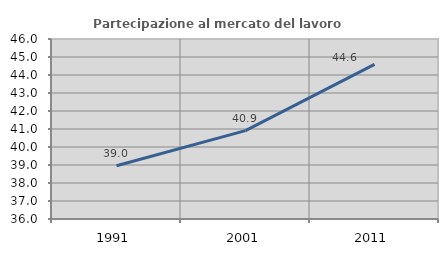
| Category | Partecipazione al mercato del lavoro  femminile |
|---|---|
| 1991.0 | 38.96 |
| 2001.0 | 40.911 |
| 2011.0 | 44.59 |